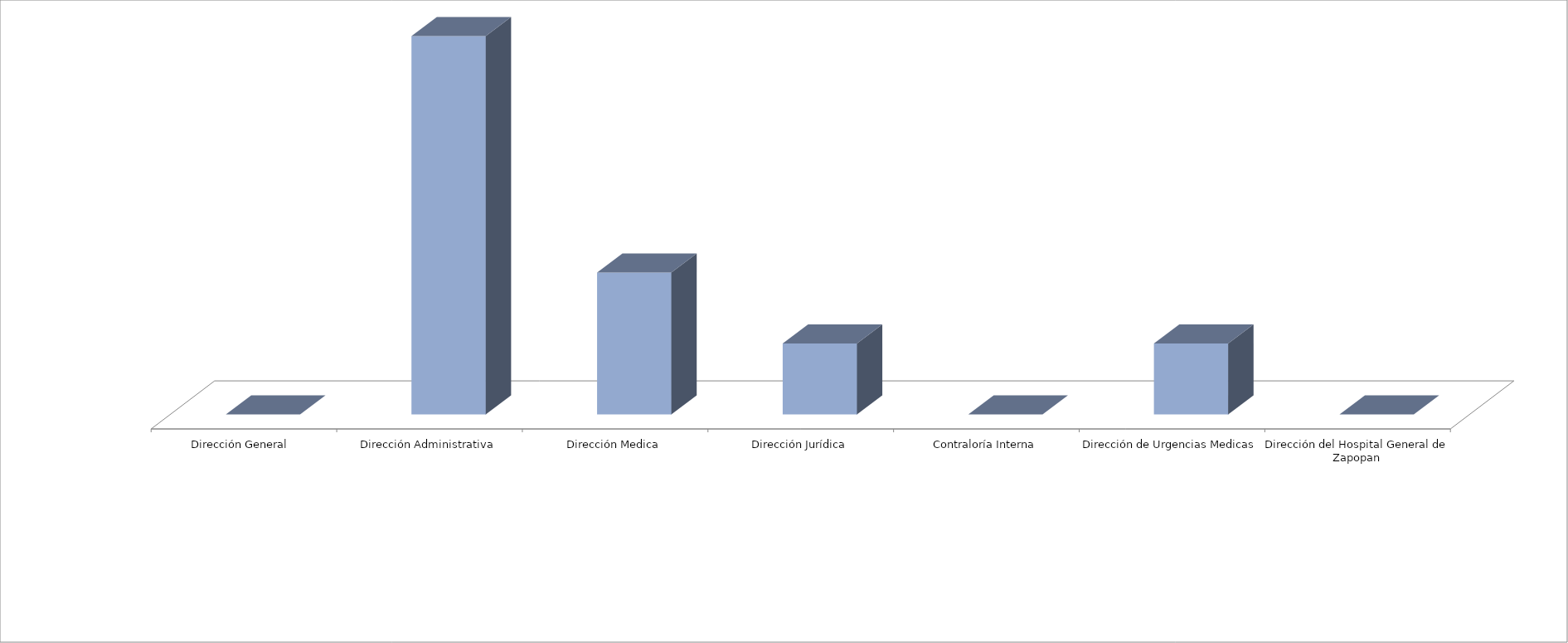
| Category | Series 0 | Series 1 |
|---|---|---|
| Dirección General  |  | 0 |
| Dirección Administrativa |  | 16 |
| Dirección Medica |  | 6 |
| Dirección Jurídica |  | 3 |
| Contraloría Interna |  | 0 |
| Dirección de Urgencias Medicas |  | 3 |
| Dirección del Hospital General de Zapopan |  | 0 |